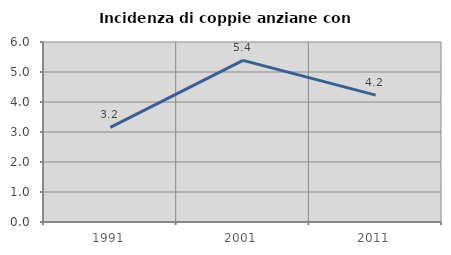
| Category | Incidenza di coppie anziane con figli |
|---|---|
| 1991.0 | 3.156 |
| 2001.0 | 5.386 |
| 2011.0 | 4.228 |